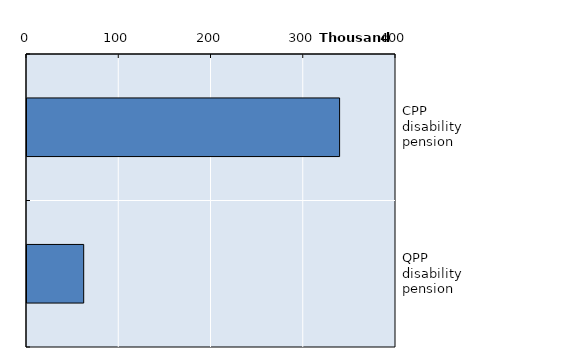
| Category | Series 0 |
|---|---|
| CPP disability pension | 338856 |
| QPP disability pension | 61466 |